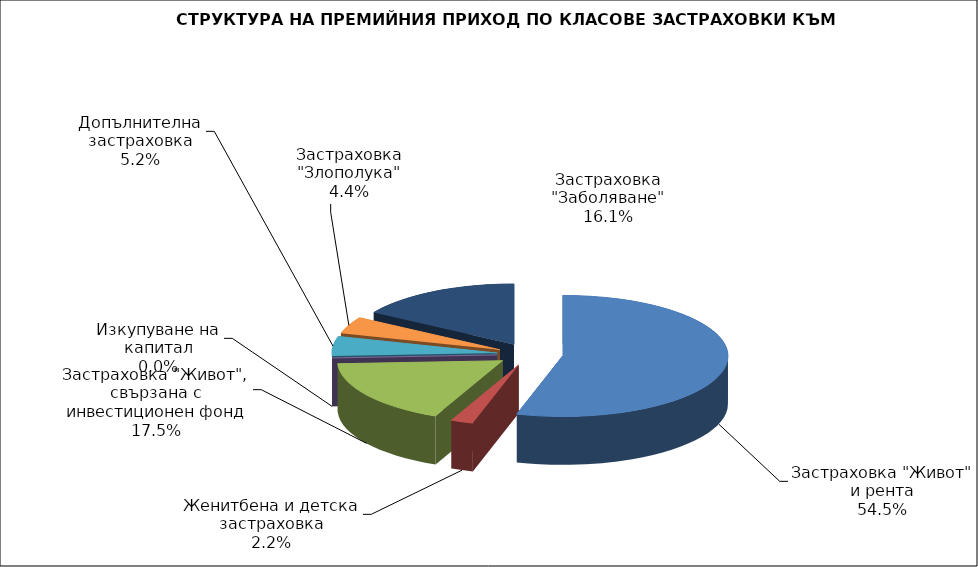
| Category | Series 0 |
|---|---|
| Застраховка "Живот" и рента | 221240543.197 |
| Женитбена и детска застраховка | 8899511.889 |
| Застраховка "Живот", свързана с инвестиционен фонд | 71220423.482 |
| Изкупуване на капитал | 0 |
| Допълнителна застраховка | 21216650.047 |
| Застраховка "Злополука" | 18066992.55 |
| Застраховка "Заболяване" | 65499831.89 |